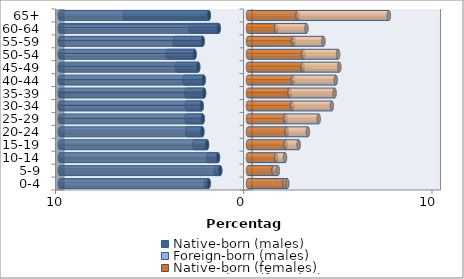
| Category | Native-born (males) | Foreign-born (males) | Native-born (females) | Foreign-born (females) |
|---|---|---|---|---|
| 0-4 | -2.091 | -0.143 | 1.945 | 0.143 |
| 5-9 | -1.479 | -0.233 | 1.362 | 0.225 |
| 10-14 | -1.597 | -0.505 | 1.493 | 0.475 |
| 15-19 | -2.178 | -0.669 | 1.998 | 0.694 |
| 20-24 | -2.427 | -0.8 | 2.058 | 1.125 |
| 25-29 | -2.408 | -0.842 | 1.986 | 1.77 |
| 30-34 | -2.464 | -0.786 | 2.355 | 2.099 |
| 35-39 | -2.335 | -0.933 | 2.209 | 2.391 |
| 40-44 | -2.357 | -1.013 | 2.384 | 2.279 |
| 45-49 | -2.647 | -1.131 | 2.908 | 1.943 |
| 50-54 | -2.838 | -1.432 | 2.937 | 1.849 |
| 55-59 | -2.41 | -1.481 | 2.414 | 1.594 |
| 60-64 | -1.559 | -1.485 | 1.504 | 1.604 |
| 65+ | -2.085 | -4.445 | 2.636 | 4.846 |